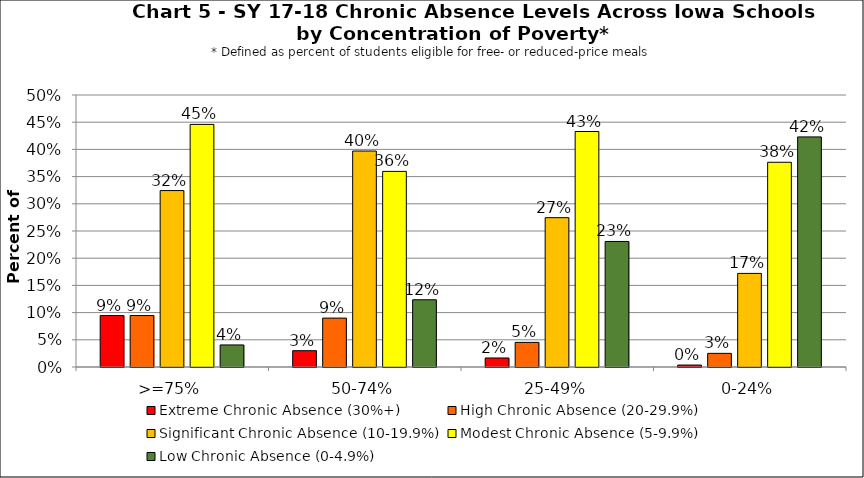
| Category | Extreme Chronic Absence (30%+) | High Chronic Absence (20-29.9%) | Significant Chronic Absence (10-19.9%) | Modest Chronic Absence (5-9.9%) | Low Chronic Absence (0-4.9%) |
|---|---|---|---|---|---|
| 0 | 0.095 | 0.095 | 0.324 | 0.446 | 0.041 |
| 1 | 0.03 | 0.09 | 0.397 | 0.36 | 0.124 |
| 2 | 0.017 | 0.045 | 0.275 | 0.433 | 0.231 |
| 3 | 0.004 | 0.025 | 0.172 | 0.376 | 0.423 |